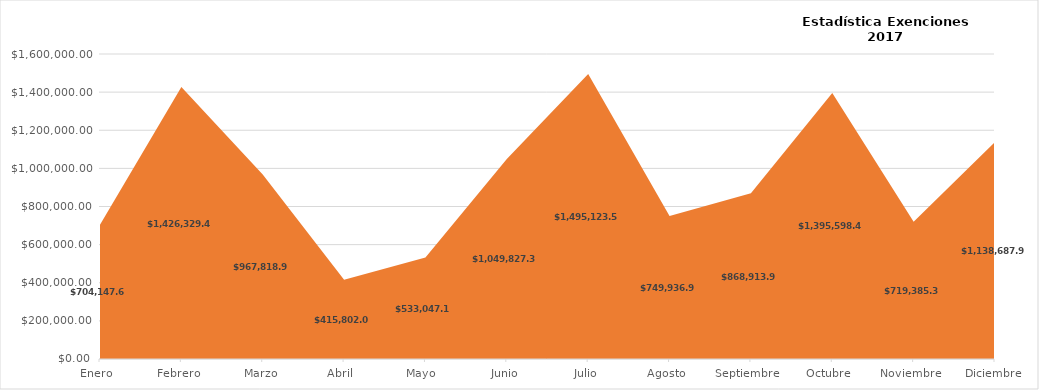
| Category | Series 0 |
|---|---|
| Enero  | 704147.67 |
| Febrero | 1426329.47 |
| Marzo | 967818.96 |
| Abril  | 415802.01 |
| Mayo  | 533047.19 |
| Junio | 1049827.33 |
| Julio | 1495123.57 |
| Agosto  | 749936.94 |
| Septiembre  | 868913.98 |
| Octubre  | 1395598.44 |
| Noviembre  | 719385.39 |
| Diciembre | 1138687.97 |